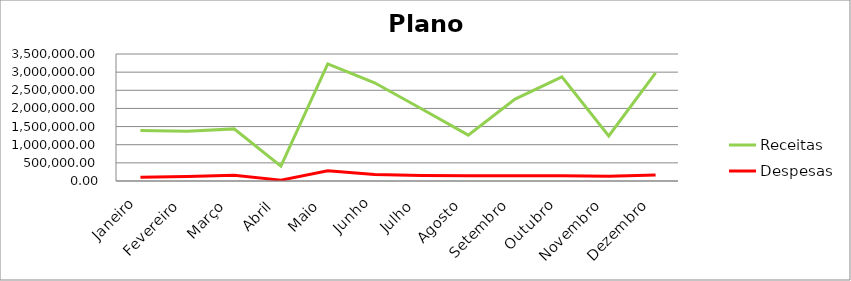
| Category | Receitas | Despesas |
|---|---|---|
| Janeiro | 1391046.48 | 106547.58 |
| Fevereiro | 1374053.31 | 125345.16 |
| Março | 1435989.04 | 159769.65 |
| Abril | 410461.34 | 24150.93 |
| Maio | 3229024.77 | 281993.2 |
| Junho | 2708062.87 | 176010.99 |
| Julho | 1990398.22 | 154256.19 |
| Agosto | 1264612.91 | 143425.51 |
| Setembro | 2259159.47 | 142133.83 |
| Outubro | 2871728.6 | 144766.86 |
| Novembro | 1240037.2 | 132129.81 |
| Dezembro | 2977572.72 | 166482.09 |